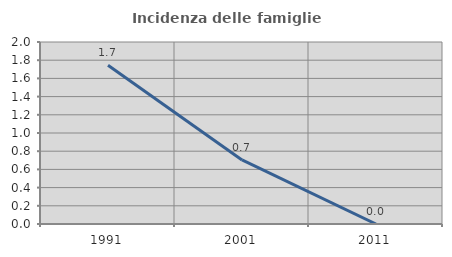
| Category | Incidenza delle famiglie numerose |
|---|---|
| 1991.0 | 1.744 |
| 2001.0 | 0.704 |
| 2011.0 | 0 |